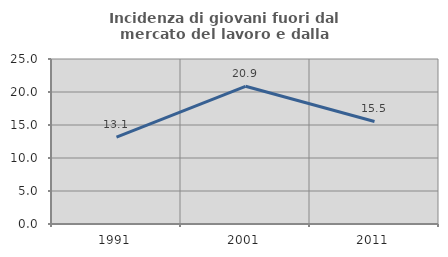
| Category | Incidenza di giovani fuori dal mercato del lavoro e dalla formazione  |
|---|---|
| 1991.0 | 13.148 |
| 2001.0 | 20.868 |
| 2011.0 | 15.532 |